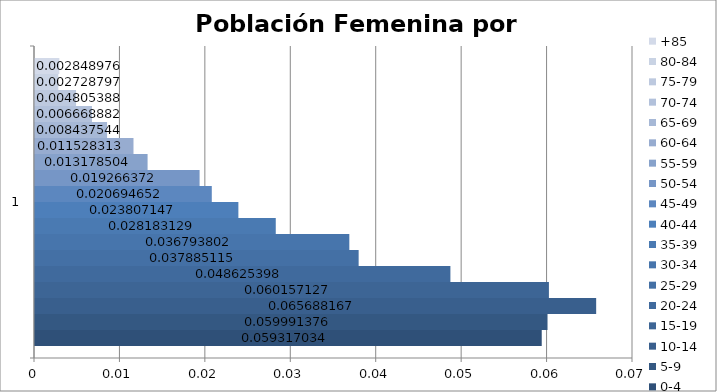
| Category | 0-4 | 5-9 | 10-14 | 15-19 | 20-24 | 25-29 | 30-34 | 35-39 | 40-44 | 45-49 | 50-54 | 55-59 | 60-64 | 65-69 | 70-74 | 75-79 | 80-84 | +85 |
|---|---|---|---|---|---|---|---|---|---|---|---|---|---|---|---|---|---|---|
| 0 | 0.059 | 0.06 | 0.066 | 0.06 | 0.049 | 0.038 | 0.037 | 0.028 | 0.024 | 0.021 | 0.019 | 0.013 | 0.012 | 0.008 | 0.007 | 0.005 | 0.003 | 0.003 |